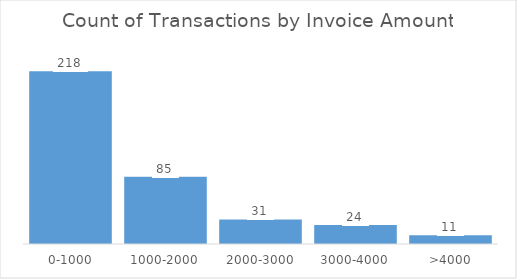
| Category | Total |
|---|---|
| 0-1000 | 218 |
| 1000-2000 | 85 |
| 2000-3000 | 31 |
| 3000-4000 | 24 |
| >4000 | 11 |